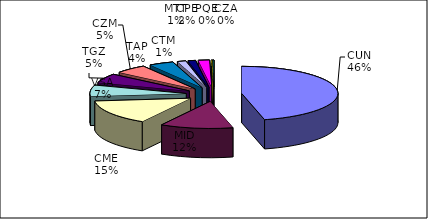
| Category | Series 0 |
|---|---|
| CUN | 106442 |
| MID | 28149 |
| CME | 34510 |
| VSA | 15436 |
| TGZ | 12607 |
| CZM | 12501 |
| TAP | 9539 |
| CTM | 3317 |
| MTT | 2887 |
| CPE | 4333 |
| PQE | 465 |
| CZA | 346 |